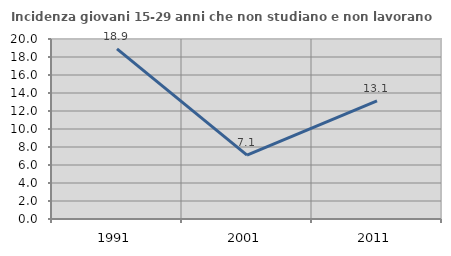
| Category | Incidenza giovani 15-29 anni che non studiano e non lavorano  |
|---|---|
| 1991.0 | 18.902 |
| 2001.0 | 7.089 |
| 2011.0 | 13.119 |